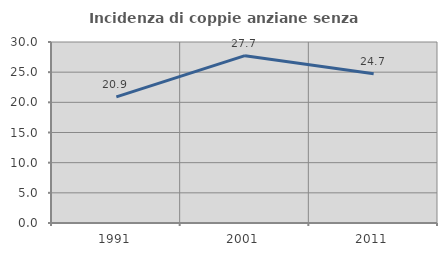
| Category | Incidenza di coppie anziane senza figli  |
|---|---|
| 1991.0 | 20.896 |
| 2001.0 | 27.731 |
| 2011.0 | 24.731 |